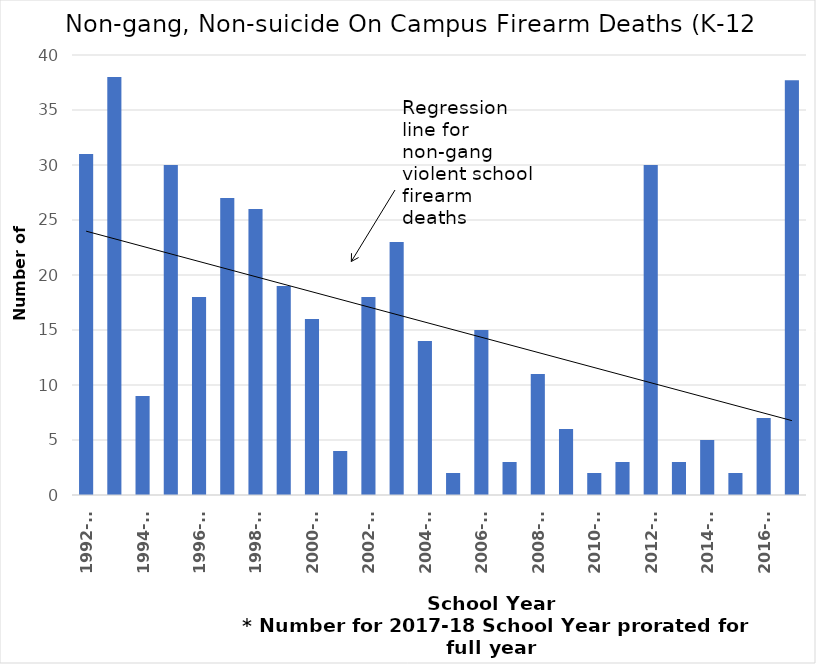
| Category | K12 |
|---|---|
| 1992-93 | 31 |
| 1993-94 | 38 |
| 1994-95 | 9 |
| 1995-96 | 30 |
| 1996-97 | 18 |
| 1997-98 | 27 |
| 1998-99 | 26 |
| 1999-00 | 19 |
| 2000-01 | 16 |
| 2001-02 | 4 |
| 2002-03 | 18 |
| 2003-04 | 23 |
| 2004-05 | 14 |
| 2005-06 | 2 |
| 2006-07 | 15 |
| 2007-08 | 3 |
| 2008-09 | 11 |
| 2009-10 | 6 |
| 2010-11 | 2 |
| 2011-12 | 3 |
| 2012-13 | 30 |
| 2013-14 | 3 |
| 2014-15 | 5 |
| 2015-16 | 2 |
| 2016-17 | 7 |
| 2017 to Feb.14, 2018* | 37.714 |